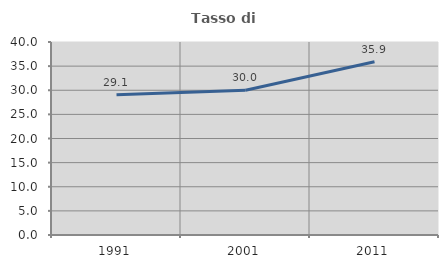
| Category | Tasso di occupazione   |
|---|---|
| 1991.0 | 29.093 |
| 2001.0 | 29.994 |
| 2011.0 | 35.892 |